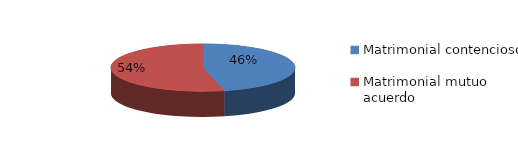
| Category | Series 0 |
|---|---|
| 0 | 470 |
| 1 | 545 |